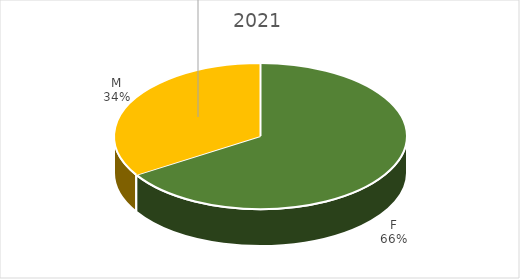
| Category | Series 0 |
|---|---|
| F | 0.661 |
| M | 0.339 |